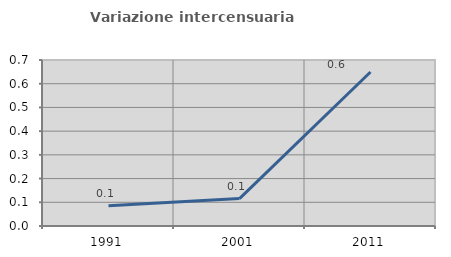
| Category | Variazione intercensuaria annua |
|---|---|
| 1991.0 | 0.085 |
| 2001.0 | 0.116 |
| 2011.0 | 0.649 |